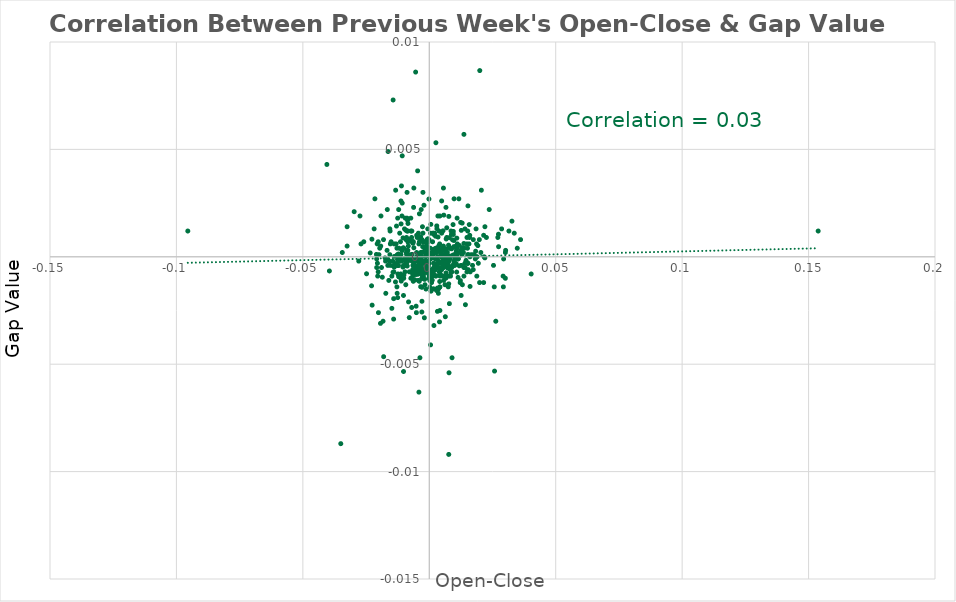
| Category | Series 0 |
|---|---|
| 0.007440000000000002 | 0 |
| -0.01432 | 0 |
| -0.0051800000000000734 | 0 |
| -0.003009999999999957 | -0.001 |
| 0.005489999999999995 | 0 |
| -0.0009900000000000464 | 0 |
| -0.0010499999999999954 | 0.001 |
| -0.010029999999999983 | -0.001 |
| 0.014529999999999932 | 0 |
| -0.0005699999999999594 | 0 |
| -0.005309999999998927 | 0 |
| 0.007140000000000035 | 0 |
| -0.002610000000000001 | 0 |
| 0.005430000000000046 | 0.001 |
| -0.02481 | -0.001 |
| 0.001420000000001087 | 0 |
| -0.00031999999999998696 | 0 |
| -0.0018599999999999728 | -0.001 |
| 0.0039399999999999435 | 0 |
| -0.0003200000000010972 | 0 |
| 0.011809999999999987 | 0.001 |
| -9.99999999995449e-06 | -0.001 |
| 0.00600999999999996 | 0 |
| 0.00488999999999995 | 0 |
| 0.018329999999999957 | 0 |
| -0.0031199999999989014 | 0.001 |
| -0.008979999999999988 | 0 |
| 0.0006099999999999994 | 0.002 |
| -0.0008199999999999319 | -0.001 |
| -0.022600000000000064 | -0.002 |
| -0.012550000000000061 | 0 |
| -0.005240000000001022 | -0.001 |
| 0.007240000000000024 | -0.001 |
| -0.008929999999999993 | 0 |
| -0.005179999999999962 | -0.001 |
| 0.00544 | 0 |
| -0.005739999999999967 | -0.001 |
| -0.0015100000000000113 | 0 |
| 0.004190000000001026 | -0.001 |
| -0.0069400000000010564 | -0.002 |
| 0.005739999999999967 | 0.002 |
| 0.0011700000000000044 | -0.001 |
| 0.012310000000000043 | -0.001 |
| 0.006819999999999937 | 0 |
| 0.0014499999999999513 | 0 |
| -0.013759999999999994 | 0 |
| 0.016119999999998913 | -0.001 |
| -0.012230000000000074 | 0 |
| 0.01055000000000006 | 0 |
| -0.004369999999999985 | -0.001 |
| 0.009530000000000038 | 0.001 |
| 0.007689999999999975 | -0.001 |
| -0.01857999999999993 | -0.001 |
| -0.0026599999999989965 | -0.001 |
| 0.004090000000001037 | 0 |
| -0.008750000000000036 | 0 |
| 0.00761999999999996 | 0.001 |
| -0.00268999999999997 | 0 |
| 0.0033800000000000496 | 0 |
| 0.0010200000000000209 | 0 |
| 0.007569999999999966 | 0 |
| 0.019199999999999995 | 0.001 |
| 0.0017899999999999583 | 0.001 |
| 0.003940000000000055 | -0.001 |
| 0.003449999999999953 | 0.001 |
| 0.003249999999999975 | -0.001 |
| 0.0008299999999999974 | -0.001 |
| 0.009749999999999925 | 0.001 |
| -0.0009299999999999864 | 0 |
| 0.009899999999999909 | 0 |
| 0.00039000000000000146 | 0 |
| 0.00024999999999997247 | 0 |
| -0.00929000000000002 | 0.001 |
| 0.011099999999999999 | 0 |
| -0.005610000000000004 | 0 |
| -0.0016100000000000003 | 0 |
| 0.011479999999999935 | 0 |
| -0.02268999999999899 | 0.001 |
| 0.03269 | 0.002 |
| -0.03949999999999998 | -0.001 |
| -0.01805000000000001 | -0.005 |
| 0.02581 | -0.005 |
| 0.01430000000000009 | -0.002 |
| 0.0030000000000000027 | 0.001 |
| -0.00499000000000005 | -0.001 |
| -0.013850000000000029 | 0 |
| 0.006669999999999954 | 0 |
| -0.003970000000000029 | -0.001 |
| 0.004329999999999945 | -0.001 |
| -0.0020700000000000163 | -0.001 |
| 0.0016999999999999238 | -0.001 |
| 0.007419999999999982 | 0 |
| 0.000260000000000038 | -0.001 |
| 0.006599999999999939 | -0.001 |
| 0.009660000000000002 | 0 |
| -0.0017099999999999893 | 0 |
| -0.008440000000000003 | 0.001 |
| 0.006649999999999934 | -0.001 |
| -0.01201999999999992 | -0.001 |
| 0.00935000000000008 | 0 |
| -0.00990000000000002 | 0 |
| 0.012919999999999932 | 0 |
| -0.0018600000000000838 | 0 |
| -0.0041200000000000125 | 0 |
| 0.0006199999999999539 | 0 |
| -0.0032799999999989504 | 0.001 |
| -0.002950000000000008 | -0.003 |
| 0.0021300000000000763 | 0 |
| -0.017490000000000006 | 0 |
| 0.003229999999999955 | -0.003 |
| -0.005780000000000007 | -0.001 |
| 0.010709999999999997 | 0 |
| 0.01088 | 0.001 |
| -0.010769999999999946 | 0 |
| 0.0024399999999999977 | 0.001 |
| 0.007139999999999924 | 0 |
| -0.012680000000000025 | 0 |
| -0.000140000000000029 | 0.003 |
| 0.02198 | 0 |
| -0.009190000000000031 | 0 |
| 0.013010000000000077 | 0.002 |
| 0.000700000000000145 | 0 |
| 0.008490000000000109 | 0 |
| -0.00021000000000004349 | -0.001 |
| 0.0039000000000000146 | -0.001 |
| 0.0025999999999999357 | -0.001 |
| -0.006440000000000001 | -0.001 |
| -0.012049999999999894 | -0.001 |
| -0.0031800000000000717 | -0.001 |
| -0.005549999999999944 | -0.001 |
| -0.0014100000000000223 | -0.001 |
| 0.009180000000000077 | 0.001 |
| 0.005510000000000126 | 0 |
| -0.010419999999999874 | 0 |
| 0.00025999999999992696 | -0.001 |
| 0.004129999999999967 | -0.001 |
| -0.005199999999999871 | 0 |
| -0.006010000000000071 | 0 |
| -0.0029400000000000537 | -0.001 |
| 0.0010599999999999499 | -0.001 |
| -0.011089999999999933 | -0.001 |
| 0.0020999999999999908 | 0 |
| -0.0029000000000000137 | 0 |
| 0.01083999999999996 | -0.001 |
| 0.00036999999999998145 | 0 |
| -0.007909999999999973 | -0.003 |
| 0.008810000000000096 | 0 |
| -0.0023600000000000287 | 0 |
| 0.0020000000000000018 | -0.001 |
| 0.0053399999999999 | 0 |
| -0.00266999999999995 | -0.001 |
| -0.006120000000000125 | 0 |
| -0.0020299999999999763 | 0 |
| -0.006319999999999992 | -0.001 |
| 0.0006800000000000139 | -0.002 |
| -0.011689999999999978 | 0 |
| -0.022830000000000017 | -0.001 |
| 0.009519999999999973 | 0.001 |
| 0.0011499999999999844 | 0 |
| 0.00027999999999994696 | -0.001 |
| 0.01366999999999996 | 0.001 |
| 0.01139000000000101 | -0.001 |
| -0.0009099999999999664 | -0.001 |
| -0.0013300000000000534 | -0.001 |
| -0.0003700000000010917 | 0 |
| -0.002989999999999937 | -0.001 |
| 0.00863999999999987 | -0.001 |
| -0.012189999999999923 | 0 |
| 0.0005600000000000049 | -0.001 |
| -0.0023300000000000542 | 0.001 |
| 0.007979999999999987 | 0 |
| -0.014080000000000092 | -0.002 |
| 0.003190000000000026 | -0.001 |
| 0.0033000000000000806 | 0 |
| 0.006909999999999972 | 0.001 |
| 0.0020900000000000363 | -0.001 |
| -0.00031000000000103167 | -0.001 |
| -0.012190000000001033 | 0 |
| -0.013630000000000031 | 0 |
| -0.012909999999999977 | 0 |
| -0.003689999999999971 | 0 |
| -0.006419999999999981 | -0.001 |
| -0.006650000000000045 | -0.001 |
| 0.005190000000000028 | -0.001 |
| -0.0008700000000000374 | 0.001 |
| -0.016349999999999976 | 0 |
| -0.0019500000000000073 | -0.003 |
| -0.008689999999998976 | 0 |
| 0.012259999999999938 | 0 |
| -0.006900000000000017 | 0 |
| 0.0029599999999999627 | 0.001 |
| 0.02739999999999998 | 0 |
| 0.004050000000001108 | -0.003 |
| 0.007940000000000058 | 0.001 |
| -0.0012199999999999989 | 0 |
| 0.002870000000000039 | -0.002 |
| -0.011390000000000011 | 0.001 |
| 0.0026199999999999557 | 0.005 |
| 0.009530000000000038 | 0 |
| 0.006819999999999937 | 0 |
| 0.0023400000000000087 | -0.001 |
| -0.0028999999999999027 | -0.002 |
| -0.012719999999999954 | 0 |
| -0.010310000000000041 | 0 |
| 0.002929999999999988 | 0 |
| -0.009480000000000044 | 0 |
| 0.0030399999999999316 | 0 |
| -0.008430000000000049 | 0.002 |
| -0.012969999999999926 | 0.001 |
| 0.01529999999999998 | 0.002 |
| -0.010180000000000078 | -0.005 |
| 0.007950000000000013 | -0.002 |
| -0.003210000000000046 | 0 |
| 0.010160000000000058 | 0 |
| -0.0040200000000000236 | -0.001 |
| -0.023360000000000047 | 0 |
| 0.01737999999999995 | -0.001 |
| -9.999999999998899e-05 | 0 |
| -0.005959999999999965 | -0.001 |
| 0.010639999999999983 | 0 |
| 0.0037599999999999856 | 0 |
| -0.005560000000000009 | -0.001 |
| -0.005730000000000013 | -0.001 |
| 0.012669999999999959 | 0.001 |
| -0.0005399999999989857 | 0.001 |
| 0.02736000000000005 | 0.001 |
| -0.013369999999999993 | -0.001 |
| 0.006689999999999974 | 0.001 |
| -0.004329999999999945 | -0.001 |
| 0.007809999999999984 | -0.005 |
| 0.0040999999999999925 | -0.001 |
| -0.006859999999999866 | 0 |
| -0.01434000000000013 | -0.001 |
| 0.006340000000000012 | -0.003 |
| 0.011859999999999982 | 0 |
| -0.0026800000000000157 | -0.001 |
| -0.00042000000000008697 | 0.001 |
| -0.005130000000000079 | 0 |
| 0.0007700000000001594 | 0 |
| -0.010380000000000056 | 0.001 |
| 0.003709999999999991 | 0 |
| 0.0018400000000000638 | -0.003 |
| 0.008119999999999905 | -0.001 |
| 0.008759999999999879 | 0.001 |
| 0.0020799999999998597 | 0 |
| 0.007730000000000015 | 0.002 |
| -0.00034000000000000696 | -0.001 |
| -0.008879999999999999 | 0 |
| -0.00645999999999991 | 0.001 |
| 0.0020000000000000018 | 0 |
| -0.003410000000000135 | -0.001 |
| -0.02092000000000016 | 0 |
| -0.011160000000000059 | 0.002 |
| 0.019969999999998933 | 0.009 |
| 0.006700000000000039 | 0 |
| -0.003410000000000024 | 0.001 |
| -0.012419999999999987 | 0 |
| -0.00611000000000006 | 0 |
| -0.0013999999999999568 | 0 |
| 0.010099999999999998 | 0 |
| -0.0050000000000000044 | 0 |
| 0.004900000000001015 | 0 |
| -0.001700000000001034 | 0 |
| -0.016699999999999937 | 0 |
| 0.014100000000000001 | 0.001 |
| 0.0050000000000000044 | -0.001 |
| -0.011299999999999977 | -0.001 |
| 0.018199999999999994 | 0 |
| -0.0048000000000000265 | 0.001 |
| -0.00039999999999995595 | 0 |
| -0.009299999999999975 | -0.001 |
| 0.0020999999999999908 | 0.001 |
| -0.010699999999999932 | 0.003 |
| 0.0041999999999999815 | 0.002 |
| 0.012700000000001044 | 0 |
| 0.01849999999999996 | 0.001 |
| -0.0038000000000000256 | -0.001 |
| -0.015100000000000002 | 0.001 |
| -0.0033000000000000806 | -0.001 |
| -0.01440000000000008 | 0 |
| 0.019899999999999918 | -0.001 |
| -0.0131 | 0.001 |
| -0.014800000000000035 | -0.002 |
| 0.0049000000000000155 | -0.001 |
| 0.01870000000000005 | 0.001 |
| -0.007899999999998908 | -0.001 |
| 0.013500000000000068 | 0 |
| 0.010599999999999943 | 0 |
| 0.0048000000000000265 | 0 |
| -0.007300000000000084 | 0.001 |
| -0.011700000000000044 | 0 |
| 0.015199999999999991 | 0.001 |
| 0.03149999999999997 | 0.001 |
| -0.007299999999999862 | -0.001 |
| -0.01540000000000008 | 0 |
| -0.006500000000000061 | -0.001 |
| 0.006199999999999872 | 0 |
| -0.00539999999999996 | 0.009 |
| 0.006099999999999994 | 0 |
| -0.008499999999999952 | 0.001 |
| 0.014899999999999913 | 0.001 |
| 0.033600000000000074 | 0.001 |
| -0.010099999999999998 | 0 |
| -0.011700000000000044 | 0.001 |
| -0.0009000000000001229 | 0.001 |
| -0.020199999999999996 | -0.001 |
| -0.008200000000001095 | -0.002 |
| -0.025900000000000034 | 0.001 |
| 0.007600000000000051 | -0.001 |
| 0.009700000000000042 | 0 |
| 0.007000000000000006 | 0 |
| -0.009199999999999986 | 0 |
| 0.0004999999999999449 | 0.001 |
| 0.0027000000000000357 | 0 |
| -0.010099999999999998 | -0.001 |
| -0.01639999999999997 | 0 |
| 0.030099999999998905 | 0 |
| 0.005900000000000016 | 0 |
| -0.017199999999999993 | -0.002 |
| -0.0026999999999999247 | 0.001 |
| -0.0009000000000000119 | 0 |
| -0.020499999999999963 | 0 |
| 0.0049000000000000155 | 0.003 |
| -0.0025000000000000577 | 0.003 |
| -0.016300000000000092 | 0.005 |
| 0.012199999999999989 | -0.001 |
| 0.01100000000000001 | 0.002 |
| 0.0008000000000000229 | 0 |
| 0.0031999999999999806 | 0 |
| -0.027000000000000024 | 0.001 |
| 0.016100000000000003 | 0 |
| 0.0026000000000000467 | 0 |
| 0.02200000000000002 | 0.001 |
| -0.0025000000000000577 | 0.001 |
| 0.029200000000000004 | -0.001 |
| -0.02739999999999998 | 0.002 |
| 0.009800000000000031 | 0 |
| 0.012399999999999967 | 0 |
| 0.029300000000000992 | -0.001 |
| -0.01890000000000014 | -0.001 |
| -0.03249999999999997 | 0 |
| -0.012800000000000034 | 0 |
| -0.006099999999999994 | 0.003 |
| -0.0062000000000010935 | -0.001 |
| -0.0014000000000000679 | 0 |
| -0.04049999999999998 | 0.004 |
| -0.020399999999999974 | -0.001 |
| 0.15379999999999994 | 0.001 |
| -0.0052000000000000934 | -0.001 |
| -0.01430000000000009 | 0.007 |
| -0.0038000000000000256 | 0 |
| -0.02080000000000004 | 0 |
| 0.014900000000000024 | -0.001 |
| -0.012199999999999989 | 0 |
| 0.006900000000000017 | 0.001 |
| -0.011199999999999988 | 0.003 |
| 0.005700000000000038 | 0 |
| -0.0016999999999999238 | -0.001 |
| -0.010800000000000032 | 0.002 |
| -0.0050000000000000044 | 0 |
| 0.010599999999999943 | 0 |
| 0.011400000000000077 | 0 |
| -0.015499999999999958 | 0.001 |
| -0.010700000000000043 | 0 |
| -0.008599999999999941 | 0 |
| -0.0023000000000000798 | -0.001 |
| -0.0119999999999989 | 0 |
| -0.0011999999999999789 | 0.001 |
| -0.011000000000001009 | 0.003 |
| 0.0033999999999989594 | 0 |
| 0.00039999999999895675 | 0 |
| -0.0010000000000000009 | 0 |
| -0.007099999999999995 | 0 |
| -0.006399999999999961 | -0.001 |
| 0.0023999999999999577 | 0 |
| -0.0034999999999999476 | 0 |
| 0.004500000000001059 | 0 |
| 0.0048000000000000265 | 0 |
| -0.006800000000000028 | 0 |
| 0.0017000000000000348 | 0 |
| 0.000500000000000056 | 0 |
| -0.0033999999999999586 | 0 |
| -0.006000000000000005 | 0 |
| -0.00870000000000104 | 0 |
| 0.0028000000000000247 | 0 |
| 0.0015000000000000568 | -0.001 |
| -0.00649999999999995 | 0 |
| 0.016000000000000014 | 0.001 |
| -0.0050000000000000044 | 0 |
| -0.0043000000000000815 | 0 |
| -0.010199999999999987 | 0 |
| 0.005600000000000049 | 0.001 |
| 0.0005999999999999339 | 0 |
| 0.007499999999999951 | -0.001 |
| 0.0038999999999989043 | -0.001 |
| 0.005900000000000016 | -0.001 |
| 0.008399999999999963 | 0 |
| -0.011900000000000022 | 0 |
| 0.016699999999999937 | 0 |
| -0.007800000000000029 | 0.001 |
| 0.0018000000000000238 | 0 |
| -0.014800000000000035 | -0.001 |
| 0.0043000000000000815 | -0.001 |
| -0.00660000000000005 | 0 |
| 0.0023999999999999577 | 0 |
| 0.014100000000000001 | 0 |
| 0.00039999999999995595 | 0 |
| 0.008199999999999985 | 0 |
| 0.007400000000000073 | 0 |
| -0.009000000000000008 | 0.001 |
| -0.01990000000000003 | 0 |
| 0.008899999999999908 | -0.001 |
| 0.007700000000001039 | 0 |
| -0.005199999999999982 | -0.002 |
| -0.0007000000000000339 | 0 |
| 0.0040999999999999925 | 0.001 |
| 0.01419999999999999 | -0.001 |
| 0.009000000000000008 | -0.005 |
| -0.006299999999999972 | 0.001 |
| -0.008600000000000052 | 0.002 |
| 0.0044000000000000705 | -0.001 |
| -0.0040999999999999925 | 0 |
| 0.006799999999998918 | 0 |
| -0.0008000000000000229 | 0 |
| 0.012900000000000023 | 0 |
| 0.005199999999999982 | 0 |
| 0.019399999999999973 | 0 |
| -0.019100000000000006 | 0.002 |
| -0.008499999999999952 | 0 |
| -0.012500000000000067 | 0.002 |
| 0.015899999999999914 | 0.001 |
| 0.021500000000000075 | 0.001 |
| 0.00660000000000005 | 0.002 |
| 0.008199999999999985 | 0 |
| -0.014100000000000001 | -0.003 |
| -0.02179999999999993 | 0.001 |
| 0.005699999999999927 | 0 |
| -0.010199999999999987 | -0.002 |
| -0.006199999999999983 | -0.001 |
| 0.006699999999999928 | 0 |
| 0.01539999999999997 | -0.001 |
| -0.008300000000001084 | 0 |
| 0.0037000000000000366 | 0 |
| 0.013700000000000045 | 0.006 |
| -0.009199999999999986 | 0.001 |
| -0.012399999999998967 | -0.001 |
| -0.006900000000000017 | 0.001 |
| -0.0041999999999999815 | 0.001 |
| -0.009000000000000008 | 0 |
| 0.01980000000000004 | 0.001 |
| 0.008599999999999941 | 0.001 |
| -0.020199999999999996 | 0.001 |
| 0.01090000000000002 | 0 |
| -0.011099999999999999 | 0 |
| 0.0028000000000000247 | 0 |
| 0.0014999999999999458 | 0.001 |
| 0.01880000000000004 | -0.001 |
| -0.007299999999999973 | 0.002 |
| -0.00010000000000109921 | -0.001 |
| 0.01770000000000005 | 0 |
| 0.0029000000000000137 | 0 |
| -0.007099999999999995 | 0 |
| -0.0050000000000000044 | 0.001 |
| -0.00649999999999995 | 0.001 |
| 0.0046999999999999265 | 0 |
| -0.0033000000000000806 | 0 |
| 0.011099999999999999 | 0.001 |
| -0.006800000000000028 | 0.001 |
| -0.00649999999999995 | 0 |
| 0.017100000000000004 | 0 |
| 0.010200000000000098 | 0 |
| 0.005499999999999949 | 0 |
| 0.013900000000000023 | 0 |
| 0.0033999999999999586 | 0 |
| -0.007900000000000018 | 0 |
| 0.006299999999998973 | -0.001 |
| 0.015800000000000036 | 0.001 |
| -0.00880000000000003 | 0.003 |
| -0.0012999999999989686 | -0.001 |
| -0.02969999999999995 | 0.002 |
| 0.008900000000000019 | -0.001 |
| -0.009499999999999953 | 0.002 |
| 0.0004999999999989457 | -0.004 |
| 0.007699999999999929 | -0.009 |
| -0.009800000000000031 | 0.001 |
| -0.018299999999999983 | -0.003 |
| -0.00880000000000003 | 0.001 |
| -0.007000000000000006 | 0.001 |
| -0.010700000000000043 | 0.005 |
| 0.0049000000000000155 | 0.001 |
| 0.011700000000000044 | 0.003 |
| -0.0029000000000000137 | 0.001 |
| -0.015799999999999925 | 0 |
| 0.005699999999999927 | -0.001 |
| 0.007799999999999918 | 0 |
| 0.0043999999999999595 | 0 |
| -0.0042999999999999705 | 0.001 |
| -0.019199999999998996 | 0.001 |
| 0.021499999999999964 | -0.001 |
| -0.005100000000001104 | -0.003 |
| 0.0036000000000000476 | -0.002 |
| -0.006199999999998984 | 0.002 |
| 0.025399999999999978 | 0 |
| 0.02059999999999995 | 0.003 |
| 0.005600000000000049 | 0.003 |
| -0.01659999999999895 | 0.002 |
| -0.0015999999999999348 | 0 |
| -9.999999999998899e-05 | 0.001 |
| -0.01079999999999992 | 0 |
| -0.0020999999999999908 | 0.002 |
| 0.006599999999999939 | 0 |
| -0.012499999999999956 | -0.002 |
| -0.018100000000000005 | 0.001 |
| -0.012700000000000045 | -0.002 |
| -0.021499999999999964 | 0.003 |
| 0.021700000000000053 | 0 |
| 0.009800000000000031 | 0.003 |
| 0.03610000000000002 | 0.001 |
| -0.017299999999999982 | 0 |
| -0.0031999999999999806 | 0.002 |
| -0.027899999999998926 | 0 |
| 0.009400000000000075 | 0.002 |
| -0.09549999999999992 | 0.001 |
| 0.01859999999999995 | 0 |
| -0.020600000000000063 | 0.001 |
| -0.006599999999999939 | 0.001 |
| -0.011199999999999988 | 0 |
| 0.018899999999999917 | 0 |
| 0.03480000000000005 | 0 |
| -0.0039000000000000146 | 0.001 |
| 0.022600000000000064 | 0.001 |
| 0.012399999999999967 | 0.002 |
| -0.01540000000000008 | 0.001 |
| 0.016199999999999992 | -0.001 |
| -0.0039000000000000146 | 0.002 |
| -0.008499999999999952 | 0 |
| 0.014800000000000035 | 0.001 |
| 0.02629999999999999 | -0.003 |
| 0.015700000000000047 | 0.001 |
| -0.013900000000000023 | 0.001 |
| -0.012800000000000034 | 0 |
| 0.020399999999999974 | 0 |
| 0.00649999999999995 | 0 |
| 0.015100000000000002 | 0 |
| 0.01739999999999997 | 0.001 |
| -0.0033999999999999586 | 0 |
| -0.01959999999999995 | 0 |
| 0.02939999999999998 | 0 |
| -0.0045999999999999375 | 0 |
| 0.0037999999999999146 | 0.001 |
| 0.015199999999999991 | 0 |
| 0.030100000000000016 | -0.001 |
| -0.015599999999999947 | 0.001 |
| -0.013300000000001089 | 0.003 |
| 0.013700000000000045 | -0.001 |
| 0.0042000000000000925 | -0.002 |
| 0.005300000000001082 | -0.001 |
| -0.03249999999999997 | 0.001 |
| 0.027100000000000013 | 0.001 |
| 0.006299999999999972 | -0.001 |
| 0.014999999999999902 | 0 |
| -0.004599999999998938 | 0.004 |
| 0.02859999999999996 | 0.001 |
| -0.011299999999999866 | -0.001 |
| -0.014000000000000012 | -0.001 |
| -0.020100000000000007 | -0.003 |
| 0.023699999999999943 | 0.002 |
| -0.008899999999999908 | 0 |
| -0.019299999999999984 | -0.003 |
| 0.0036000000000000476 | -0.001 |
| 0.010099999999999998 | 0 |
| 0.008399999999999963 | -0.001 |
| 0.025700000000000056 | -0.001 |
| 0.009800000000000031 | 0 |
| -0.0033000000000000806 | 0 |
| 0.010099999999999998 | 0 |
| 0.006199999999999983 | -0.001 |
| 0.01550000000000007 | 0 |
| -0.012799999999999923 | -0.001 |
| 0.0013000000000000789 | -0.001 |
| 0.01309999999999989 | -0.001 |
| -0.0042999999999999705 | 0 |
| 0.006999999999999895 | 0 |
| 0.005199999999999871 | 0 |
| 0.030200000000000005 | 0 |
| 0.01519999999999988 | 0 |
| 0.0403 | -0.001 |
| 0.013700000000000045 | 0 |
| -0.0040999999999999925 | 0.001 |
| -0.009600000000000053 | -0.001 |
| -0.015600000000000058 | 0 |
| -0.034399999999999986 | 0 |
| -0.03499999999999992 | -0.009 |
| -0.0036999999999998145 | -0.005 |
| -0.008800000000000141 | 0.002 |
| 0.0034000000000000696 | 0.002 |
| -0.0042999999999999705 | -0.001 |
| -0.0018000000000000238 | 0.001 |
| -0.0040999999999999925 | -0.006 |
| -0.0040999999999999925 | 0 |
| 0.01529999999999987 | 0 |
| -0.00019999999999997797 | -0.001 |
| 0.0013000000000000789 | 0.001 |
| 0.0009000000000001229 | -0.001 |
| -0.0005999999999999339 | 0.001 |
| -0.0121 | 0.002 |
| -0.02079999999999993 | 0 |
| -0.016000000000000014 | -0.001 |
| -0.0028999999999999027 | 0 |
| 0.012599999999999945 | -0.002 |